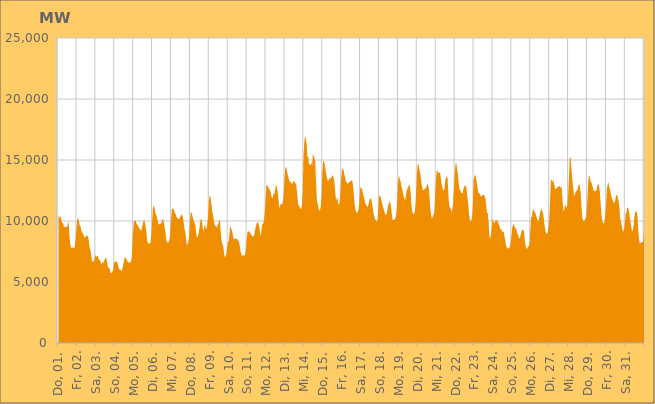
| Category | Series 0 |
|---|---|
|  Do, 01.  | 10529.707 |
|  Do, 01.  | 10336.533 |
|  Do, 01.  | 10233.402 |
|  Do, 01.  | 10405.659 |
|  Do, 01.  | 10016.815 |
|  Do, 01.  | 9789.613 |
|  Do, 01.  | 9846.499 |
|  Do, 01.  | 9518.952 |
|  Do, 01.  | 9498.58 |
|  Do, 01.  | 9533.588 |
|  Do, 01.  | 9474.868 |
|  Do, 01.  | 9495.711 |
|  Do, 01.  | 9798.766 |
|  Do, 01.  | 9944.01 |
|  Do, 01.  | 8814.898 |
|  Do, 01.  | 8136.763 |
|  Do, 01.  | 7832.044 |
|  Fr, 02.  | 7772.171 |
|  Fr, 02.  | 7843.569 |
|  Fr, 02.  | 7783.411 |
|  Fr, 02.  | 7748.673 |
|  Fr, 02.  | 7987.132 |
|  Fr, 02.  | 8657.65 |
|  Fr, 02.  | 9539.614 |
|  Fr, 02.  | 10157.018 |
|  Fr, 02.  | 10264.56 |
|  Fr, 02.  | 10034.876 |
|  Fr, 02.  | 9632.606 |
|  Fr, 02.  | 9578.474 |
|  Fr, 02.  | 9219.749 |
|  Fr, 02.  | 9088.731 |
|  Fr, 02.  | 8961.663 |
|  Fr, 02.  | 8824.625 |
|  Fr, 02.  | 8619.725 |
|  Fr, 02.  | 8675.437 |
|  Fr, 02.  | 8736.554 |
|  Fr, 02.  | 8821.018 |
|  Fr, 02.  | 8784.877 |
|  Fr, 02.  | 8654.113 |
|  Fr, 02.  | 8112.833 |
|  Fr, 02.  | 7747.127 |
|  Sa, 03.  | 7496.125 |
|  Sa, 03.  | 6970.843 |
|  Sa, 03.  | 6598.495 |
|  Sa, 03.  | 6758.544 |
|  Sa, 03.  | 6652.237 |
|  Sa, 03.  | 6864.484 |
|  Sa, 03.  | 7237.163 |
|  Sa, 03.  | 7072.676 |
|  Sa, 03.  | 7091.753 |
|  Sa, 03.  | 7154.961 |
|  Sa, 03.  | 6863.168 |
|  Sa, 03.  | 6836.559 |
|  Sa, 03.  | 6741.738 |
|  Sa, 03.  | 6559.065 |
|  Sa, 03.  | 6403.012 |
|  Sa, 03.  | 6670.532 |
|  Sa, 03.  | 6558.803 |
|  Sa, 03.  | 6756.398 |
|  Sa, 03.  | 6852.703 |
|  Sa, 03.  | 7016.3 |
|  Sa, 03.  | 6890.49 |
|  Sa, 03.  | 6496.418 |
|  Sa, 03.  | 6216.212 |
|  Sa, 03.  | 6128.025 |
|  So, 04.  | 6101.13 |
|  So, 04.  | 5755.835 |
|  So, 04.  | 5744.577 |
|  So, 04.  | 5758.574 |
|  So, 04.  | 5895.602 |
|  So, 04.  | 6231.551 |
|  So, 04.  | 6630.064 |
|  So, 04.  | 6691.717 |
|  So, 04.  | 6616.23 |
|  So, 04.  | 6706.952 |
|  So, 04.  | 6564.448 |
|  So, 04.  | 6299.091 |
|  So, 04.  | 6054.235 |
|  So, 04.  | 6023.009 |
|  So, 04.  | 6005.97 |
|  So, 04.  | 5879.537 |
|  So, 04.  | 6037.065 |
|  So, 04.  | 6328.093 |
|  So, 04.  | 6646.866 |
|  So, 04.  | 7011.484 |
|  So, 04.  | 7028.644 |
|  So, 04.  | 6911.182 |
|  So, 04.  | 6764.596 |
|  So, 04.  | 6662.201 |
|  Mo, 05.  | 6577.666 |
|  Mo, 05.  | 6625.01 |
|  Mo, 05.  | 6628.244 |
|  Mo, 05.  | 6651.648 |
|  Mo, 05.  | 7022.396 |
|  Mo, 05.  | 8024.23 |
|  Mo, 05.  | 9274.168 |
|  Mo, 05.  | 10010.13 |
|  Mo, 05.  | 10040.842 |
|  Mo, 05.  | 10001.475 |
|  Mo, 05.  | 9807.434 |
|  Mo, 05.  | 9723.593 |
|  Mo, 05.  | 9646.007 |
|  Mo, 05.  | 9450.456 |
|  Mo, 05.  | 9377.962 |
|  Mo, 05.  | 9272.21 |
|  Mo, 05.  | 9202.304 |
|  Mo, 05.  | 9459.854 |
|  Mo, 05.  | 9699.642 |
|  Mo, 05.  | 10034.983 |
|  Mo, 05.  | 10065.07 |
|  Mo, 05.  | 9877.112 |
|  Mo, 05.  | 9421.021 |
|  Mo, 05.  | 8887.11 |
|  Di, 06.  | 8286.227 |
|  Di, 06.  | 8171.97 |
|  Di, 06.  | 8140.817 |
|  Di, 06.  | 8157.813 |
|  Di, 06.  | 8257.156 |
|  Di, 06.  | 8862.049 |
|  Di, 06.  | 10032.86 |
|  Di, 06.  | 11034.859 |
|  Di, 06.  | 11286.864 |
|  Di, 06.  | 11083.124 |
|  Di, 06.  | 10651.99 |
|  Di, 06.  | 10561.061 |
|  Di, 06.  | 10269.579 |
|  Di, 06.  | 10070.448 |
|  Di, 06.  | 9772.598 |
|  Di, 06.  | 9707.713 |
|  Di, 06.  | 9784.902 |
|  Di, 06.  | 9739.165 |
|  Di, 06.  | 9865.709 |
|  Di, 06.  | 10180.245 |
|  Di, 06.  | 10124.668 |
|  Di, 06.  | 9852.929 |
|  Di, 06.  | 9403.271 |
|  Di, 06.  | 9010.484 |
|  Mi, 07.  | 8425.038 |
|  Mi, 07.  | 8265.14 |
|  Mi, 07.  | 8193.27 |
|  Mi, 07.  | 8297.545 |
|  Mi, 07.  | 8530.819 |
|  Mi, 07.  | 9060.953 |
|  Mi, 07.  | 9992.048 |
|  Mi, 07.  | 10940.264 |
|  Mi, 07.  | 11011.997 |
|  Mi, 07.  | 11007.603 |
|  Mi, 07.  | 10797.393 |
|  Mi, 07.  | 10648.533 |
|  Mi, 07.  | 10532.318 |
|  Mi, 07.  | 10332.292 |
|  Mi, 07.  | 10232.082 |
|  Mi, 07.  | 10175.733 |
|  Mi, 07.  | 10202.736 |
|  Mi, 07.  | 10197.581 |
|  Mi, 07.  | 10400.975 |
|  Mi, 07.  | 10501.787 |
|  Mi, 07.  | 10502.407 |
|  Mi, 07.  | 10323.427 |
|  Mi, 07.  | 9880.568 |
|  Mi, 07.  | 9309.777 |
|  Do, 08.  | 9139.851 |
|  Do, 08.  | 8525.452 |
|  Do, 08.  | 8037.667 |
|  Do, 08.  | 8087.292 |
|  Do, 08.  | 8312.693 |
|  Do, 08.  | 8922.248 |
|  Do, 08.  | 10061.622 |
|  Do, 08.  | 10705.818 |
|  Do, 08.  | 10704.222 |
|  Do, 08.  | 10439.516 |
|  Do, 08.  | 10183.479 |
|  Do, 08.  | 9991.294 |
|  Do, 08.  | 9836.125 |
|  Do, 08.  | 9549.21 |
|  Do, 08.  | 8923.398 |
|  Do, 08.  | 8618.108 |
|  Do, 08.  | 8725.768 |
|  Do, 08.  | 9015.013 |
|  Do, 08.  | 9404.075 |
|  Do, 08.  | 9905.863 |
|  Do, 08.  | 10205.512 |
|  Do, 08.  | 10088.837 |
|  Do, 08.  | 9547.895 |
|  Do, 08.  | 9142.056 |
|  Fr, 09.  | 9413.105 |
|  Fr, 09.  | 9809.647 |
|  Fr, 09.  | 9384.471 |
|  Fr, 09.  | 9332.834 |
|  Fr, 09.  | 9769.149 |
|  Fr, 09.  | 10483.866 |
|  Fr, 09.  | 11645.975 |
|  Fr, 09.  | 12042.567 |
|  Fr, 09.  | 12040.481 |
|  Fr, 09.  | 11519.603 |
|  Fr, 09.  | 10870.809 |
|  Fr, 09.  | 10530.66 |
|  Fr, 09.  | 10209.59 |
|  Fr, 09.  | 9759.754 |
|  Fr, 09.  | 9617.303 |
|  Fr, 09.  | 9510.223 |
|  Fr, 09.  | 9515.348 |
|  Fr, 09.  | 9633.579 |
|  Fr, 09.  | 9792.616 |
|  Fr, 09.  | 10049.787 |
|  Fr, 09.  | 10015.872 |
|  Fr, 09.  | 9215.068 |
|  Fr, 09.  | 8415.315 |
|  Fr, 09.  | 8141.303 |
|  Sa, 10.  | 7987.551 |
|  Sa, 10.  | 7489.514 |
|  Sa, 10.  | 7032.654 |
|  Sa, 10.  | 7124.692 |
|  Sa, 10.  | 7218.664 |
|  Sa, 10.  | 7769.507 |
|  Sa, 10.  | 8245.144 |
|  Sa, 10.  | 8312.283 |
|  Sa, 10.  | 8895.493 |
|  Sa, 10.  | 9532.242 |
|  Sa, 10.  | 9443.374 |
|  Sa, 10.  | 9250.226 |
|  Sa, 10.  | 9017.804 |
|  Sa, 10.  | 8621.468 |
|  Sa, 10.  | 8487.349 |
|  Sa, 10.  | 8584.149 |
|  Sa, 10.  | 8544.465 |
|  Sa, 10.  | 8525.974 |
|  Sa, 10.  | 8530.084 |
|  Sa, 10.  | 8376.597 |
|  Sa, 10.  | 8328.932 |
|  Sa, 10.  | 8052.787 |
|  Sa, 10.  | 7541.128 |
|  Sa, 10.  | 7323.861 |
|  So, 11.  | 7086.737 |
|  So, 11.  | 7225.431 |
|  So, 11.  | 7199.097 |
|  So, 11.  | 7131.192 |
|  So, 11.  | 7285.737 |
|  So, 11.  | 7773.653 |
|  So, 11.  | 8542.854 |
|  So, 11.  | 9121.005 |
|  So, 11.  | 9098.106 |
|  So, 11.  | 9199.176 |
|  So, 11.  | 9060.299 |
|  So, 11.  | 8938.689 |
|  So, 11.  | 8856.494 |
|  So, 11.  | 8726.173 |
|  So, 11.  | 8770.369 |
|  So, 11.  | 8732.192 |
|  So, 11.  | 9038.479 |
|  So, 11.  | 9396.121 |
|  So, 11.  | 9669.865 |
|  So, 11.  | 9842.733 |
|  So, 11.  | 9920.02 |
|  So, 11.  | 9758.421 |
|  So, 11.  | 9526.023 |
|  So, 11.  | 8991.296 |
|  Mo, 12.  | 8741.05 |
|  Mo, 12.  | 9450.156 |
|  Mo, 12.  | 9770.098 |
|  Mo, 12.  | 9740.806 |
|  Mo, 12.  | 10154.949 |
|  Mo, 12.  | 10681.881 |
|  Mo, 12.  | 11772.958 |
|  Mo, 12.  | 12975.647 |
|  Mo, 12.  | 12905.045 |
|  Mo, 12.  | 12838.434 |
|  Mo, 12.  | 12699.101 |
|  Mo, 12.  | 12571.12 |
|  Mo, 12.  | 12449.72 |
|  Mo, 12.  | 12155.104 |
|  Mo, 12.  | 11907.767 |
|  Mo, 12.  | 11897.613 |
|  Mo, 12.  | 12258.328 |
|  Mo, 12.  | 12205.444 |
|  Mo, 12.  | 12499.811 |
|  Mo, 12.  | 12925.302 |
|  Mo, 12.  | 12853.913 |
|  Mo, 12.  | 12509.906 |
|  Mo, 12.  | 12022.841 |
|  Mo, 12.  | 11269.834 |
|  Di, 13.  | 11029.107 |
|  Di, 13.  | 11390.864 |
|  Di, 13.  | 11398.339 |
|  Di, 13.  | 11325.055 |
|  Di, 13.  | 11586.458 |
|  Di, 13.  | 12272.787 |
|  Di, 13.  | 13523.71 |
|  Di, 13.  | 14333.438 |
|  Di, 13.  | 14465.124 |
|  Di, 13.  | 14155.82 |
|  Di, 13.  | 13781.302 |
|  Di, 13.  | 13543.219 |
|  Di, 13.  | 13349.174 |
|  Di, 13.  | 13191.632 |
|  Di, 13.  | 13198.03 |
|  Di, 13.  | 13040.455 |
|  Di, 13.  | 13081.642 |
|  Di, 13.  | 13253.882 |
|  Di, 13.  | 13284.797 |
|  Di, 13.  | 13146.584 |
|  Di, 13.  | 13087.559 |
|  Di, 13.  | 12906.938 |
|  Di, 13.  | 12246.95 |
|  Di, 13.  | 11496.5 |
|  Mi, 14.  | 11254.484 |
|  Mi, 14.  | 11192.483 |
|  Mi, 14.  | 11000.555 |
|  Mi, 14.  | 10976.282 |
|  Mi, 14.  | 11287.2 |
|  Mi, 14.  | 12358.431 |
|  Mi, 14.  | 15085.202 |
|  Mi, 14.  | 16369.51 |
|  Mi, 14.  | 16919.316 |
|  Mi, 14.  | 16818.05 |
|  Mi, 14.  | 16325.845 |
|  Mi, 14.  | 15299.617 |
|  Mi, 14.  | 15290.634 |
|  Mi, 14.  | 14649.702 |
|  Mi, 14.  | 14642.315 |
|  Mi, 14.  | 14540.523 |
|  Mi, 14.  | 14804.078 |
|  Mi, 14.  | 14571.708 |
|  Mi, 14.  | 15472.823 |
|  Mi, 14.  | 15343.81 |
|  Mi, 14.  | 15151.949 |
|  Mi, 14.  | 14842.303 |
|  Mi, 14.  | 13162.531 |
|  Mi, 14.  | 11798.211 |
|  Do, 15.  | 11432.457 |
|  Do, 15.  | 11108.313 |
|  Do, 15.  | 10840.644 |
|  Do, 15.  | 10926.781 |
|  Do, 15.  | 11167.095 |
|  Do, 15.  | 12078.19 |
|  Do, 15.  | 14036.841 |
|  Do, 15.  | 14932.538 |
|  Do, 15.  | 14889.247 |
|  Do, 15.  | 14657.616 |
|  Do, 15.  | 14255.425 |
|  Do, 15.  | 13803.549 |
|  Do, 15.  | 13551.982 |
|  Do, 15.  | 13270.766 |
|  Do, 15.  | 13329.463 |
|  Do, 15.  | 13524.739 |
|  Do, 15.  | 13495.227 |
|  Do, 15.  | 13471.776 |
|  Do, 15.  | 13701.6 |
|  Do, 15.  | 13727.512 |
|  Do, 15.  | 13613.618 |
|  Do, 15.  | 13318.861 |
|  Do, 15.  | 12730.504 |
|  Do, 15.  | 11835.434 |
|  Fr, 16.  | 11737.186 |
|  Fr, 16.  | 11999.883 |
|  Fr, 16.  | 11434.313 |
|  Fr, 16.  | 11343.227 |
|  Fr, 16.  | 11599.645 |
|  Fr, 16.  | 12346.194 |
|  Fr, 16.  | 13555.305 |
|  Fr, 16.  | 14246.805 |
|  Fr, 16.  | 14311.722 |
|  Fr, 16.  | 14129.759 |
|  Fr, 16.  | 13820.115 |
|  Fr, 16.  | 13541.526 |
|  Fr, 16.  | 13177.377 |
|  Fr, 16.  | 13225.505 |
|  Fr, 16.  | 13007.624 |
|  Fr, 16.  | 13113.843 |
|  Fr, 16.  | 13196.627 |
|  Fr, 16.  | 13206.998 |
|  Fr, 16.  | 13284.799 |
|  Fr, 16.  | 13327.876 |
|  Fr, 16.  | 13325.027 |
|  Fr, 16.  | 12851.113 |
|  Fr, 16.  | 12204.528 |
|  Fr, 16.  | 11394.074 |
|  Sa, 17.  | 10971.341 |
|  Sa, 17.  | 10682.271 |
|  Sa, 17.  | 10689.238 |
|  Sa, 17.  | 10754.533 |
|  Sa, 17.  | 11002.277 |
|  Sa, 17.  | 11683.485 |
|  Sa, 17.  | 12594.949 |
|  Sa, 17.  | 12819.376 |
|  Sa, 17.  | 12649.457 |
|  Sa, 17.  | 12442.98 |
|  Sa, 17.  | 12094.377 |
|  Sa, 17.  | 11906.014 |
|  Sa, 17.  | 11594.225 |
|  Sa, 17.  | 11350.256 |
|  Sa, 17.  | 11316.724 |
|  Sa, 17.  | 11120.709 |
|  Sa, 17.  | 11227.621 |
|  Sa, 17.  | 11483.157 |
|  Sa, 17.  | 11754.547 |
|  Sa, 17.  | 11853.348 |
|  Sa, 17.  | 11841.255 |
|  Sa, 17.  | 11478.188 |
|  Sa, 17.  | 11038.52 |
|  Sa, 17.  | 10560.472 |
|  So, 18.  | 10387.607 |
|  So, 18.  | 10151.713 |
|  So, 18.  | 10043.455 |
|  So, 18.  | 9950.271 |
|  So, 18.  | 10081.894 |
|  So, 18.  | 11008.173 |
|  So, 18.  | 11991.096 |
|  So, 18.  | 12119.902 |
|  So, 18.  | 11974.254 |
|  So, 18.  | 11706.868 |
|  So, 18.  | 11400.714 |
|  So, 18.  | 11186.03 |
|  So, 18.  | 10926.728 |
|  So, 18.  | 10699.705 |
|  So, 18.  | 10527.653 |
|  So, 18.  | 10484.803 |
|  So, 18.  | 10718.019 |
|  So, 18.  | 11031.858 |
|  So, 18.  | 11421.413 |
|  So, 18.  | 11572.825 |
|  So, 18.  | 11560.658 |
|  So, 18.  | 11203.324 |
|  So, 18.  | 10673.623 |
|  So, 18.  | 10112.069 |
|  Mo, 19.  | 10077.185 |
|  Mo, 19.  | 10097.936 |
|  Mo, 19.  | 10156.862 |
|  Mo, 19.  | 10280.285 |
|  Mo, 19.  | 10694.825 |
|  Mo, 19.  | 11671.021 |
|  Mo, 19.  | 12963.677 |
|  Mo, 19.  | 13803.511 |
|  Mo, 19.  | 13515.632 |
|  Mo, 19.  | 13334.829 |
|  Mo, 19.  | 13009.519 |
|  Mo, 19.  | 12696.438 |
|  Mo, 19.  | 12418.138 |
|  Mo, 19.  | 12051.315 |
|  Mo, 19.  | 11876.242 |
|  Mo, 19.  | 11712.381 |
|  Mo, 19.  | 12015.511 |
|  Mo, 19.  | 12499.396 |
|  Mo, 19.  | 12641.637 |
|  Mo, 19.  | 12784.186 |
|  Mo, 19.  | 12969.051 |
|  Mo, 19.  | 12894.996 |
|  Mo, 19.  | 12365.927 |
|  Mo, 19.  | 11363.607 |
|  Di, 20.  | 10828.228 |
|  Di, 20.  | 10589.563 |
|  Di, 20.  | 10567.361 |
|  Di, 20.  | 10670.656 |
|  Di, 20.  | 11168.174 |
|  Di, 20.  | 12293.058 |
|  Di, 20.  | 13823.6 |
|  Di, 20.  | 14650.267 |
|  Di, 20.  | 14652.409 |
|  Di, 20.  | 14293.47 |
|  Di, 20.  | 13980.502 |
|  Di, 20.  | 13539.279 |
|  Di, 20.  | 13016.704 |
|  Di, 20.  | 12682.462 |
|  Di, 20.  | 12513.989 |
|  Di, 20.  | 12560.375 |
|  Di, 20.  | 12629.963 |
|  Di, 20.  | 12687.865 |
|  Di, 20.  | 12758.694 |
|  Di, 20.  | 13052.038 |
|  Di, 20.  | 12947.857 |
|  Di, 20.  | 12721.665 |
|  Di, 20.  | 11971.566 |
|  Di, 20.  | 11073.267 |
|  Mi, 21.  | 10499.236 |
|  Mi, 21.  | 10188.118 |
|  Mi, 21.  | 10316.012 |
|  Mi, 21.  | 10535.588 |
|  Mi, 21.  | 10652.774 |
|  Mi, 21.  | 11777.276 |
|  Mi, 21.  | 13153.782 |
|  Mi, 21.  | 14096.616 |
|  Mi, 21.  | 14167.47 |
|  Mi, 21.  | 13900.033 |
|  Mi, 21.  | 13973.923 |
|  Mi, 21.  | 14027.303 |
|  Mi, 21.  | 13745.706 |
|  Mi, 21.  | 13131.597 |
|  Mi, 21.  | 12862.837 |
|  Mi, 21.  | 12596.278 |
|  Mi, 21.  | 12475.427 |
|  Mi, 21.  | 12683.824 |
|  Mi, 21.  | 13320.586 |
|  Mi, 21.  | 13593.361 |
|  Mi, 21.  | 13662.716 |
|  Mi, 21.  | 13443.478 |
|  Mi, 21.  | 12109.902 |
|  Mi, 21.  | 11198.909 |
|  Do, 22.  | 11133.62 |
|  Do, 22.  | 10945.931 |
|  Do, 22.  | 10736.795 |
|  Do, 22.  | 10956.369 |
|  Do, 22.  | 11593.813 |
|  Do, 22.  | 12741.513 |
|  Do, 22.  | 13958.789 |
|  Do, 22.  | 14662.989 |
|  Do, 22.  | 14752.081 |
|  Do, 22.  | 14296.643 |
|  Do, 22.  | 13849.112 |
|  Do, 22.  | 13088.864 |
|  Do, 22.  | 12613.345 |
|  Do, 22.  | 12547.389 |
|  Do, 22.  | 12351.4 |
|  Do, 22.  | 12266.664 |
|  Do, 22.  | 12219.767 |
|  Do, 22.  | 12591.704 |
|  Do, 22.  | 12800.21 |
|  Do, 22.  | 12932.904 |
|  Do, 22.  | 12857.158 |
|  Do, 22.  | 12634.662 |
|  Do, 22.  | 11992.164 |
|  Do, 22.  | 11517.577 |
|  Fr, 23.  | 10634.33 |
|  Fr, 23.  | 10156.95 |
|  Fr, 23.  | 9937.284 |
|  Fr, 23.  | 10050.572 |
|  Fr, 23.  | 10310.397 |
|  Fr, 23.  | 11272.053 |
|  Fr, 23.  | 13310.069 |
|  Fr, 23.  | 13685.202 |
|  Fr, 23.  | 13773.63 |
|  Fr, 23.  | 13536.317 |
|  Fr, 23.  | 13135.155 |
|  Fr, 23.  | 12713.013 |
|  Fr, 23.  | 12324.396 |
|  Fr, 23.  | 12259.719 |
|  Fr, 23.  | 12232.77 |
|  Fr, 23.  | 12039.66 |
|  Fr, 23.  | 11979.091 |
|  Fr, 23.  | 12157.893 |
|  Fr, 23.  | 12138.128 |
|  Fr, 23.  | 12135.494 |
|  Fr, 23.  | 12030.495 |
|  Fr, 23.  | 11795.125 |
|  Fr, 23.  | 11207.184 |
|  Fr, 23.  | 10631.53 |
|  Sa, 24.  | 10671.62 |
|  Sa, 24.  | 9960.392 |
|  Sa, 24.  | 8826.696 |
|  Sa, 24.  | 8557.029 |
|  Sa, 24.  | 8894.996 |
|  Sa, 24.  | 9456.553 |
|  Sa, 24.  | 10192.513 |
|  Sa, 24.  | 10011.538 |
|  Sa, 24.  | 9823.178 |
|  Sa, 24.  | 9875.339 |
|  Sa, 24.  | 10098.859 |
|  Sa, 24.  | 9999.553 |
|  Sa, 24.  | 10092.555 |
|  Sa, 24.  | 9919.467 |
|  Sa, 24.  | 9729.876 |
|  Sa, 24.  | 9573.903 |
|  Sa, 24.  | 9286.922 |
|  Sa, 24.  | 9365.463 |
|  Sa, 24.  | 9157.477 |
|  Sa, 24.  | 9091.61 |
|  Sa, 24.  | 9142.456 |
|  Sa, 24.  | 8779.311 |
|  Sa, 24.  | 8466.404 |
|  Sa, 24.  | 8001.866 |
|  So, 25.  | 7842.157 |
|  So, 25.  | 7799.744 |
|  So, 25.  | 7750.321 |
|  So, 25.  | 7735.64 |
|  So, 25.  | 7910.378 |
|  So, 25.  | 8172.234 |
|  So, 25.  | 8799.676 |
|  So, 25.  | 9498.477 |
|  So, 25.  | 9647.508 |
|  So, 25.  | 9785.461 |
|  So, 25.  | 9543.094 |
|  So, 25.  | 9407.245 |
|  So, 25.  | 9360.44 |
|  So, 25.  | 9081.467 |
|  So, 25.  | 8895.921 |
|  So, 25.  | 8708.966 |
|  So, 25.  | 8565.929 |
|  So, 25.  | 8639.695 |
|  So, 25.  | 8952.562 |
|  So, 25.  | 9167.017 |
|  So, 25.  | 9330.037 |
|  So, 25.  | 9249.374 |
|  So, 25.  | 9146.62 |
|  So, 25.  | 8354.917 |
|  So, 25.  | 7929.225 |
|  Mo, 26.  | 7757.803 |
|  Mo, 26.  | 7748.907 |
|  Mo, 26.  | 7873.866 |
|  Mo, 26.  | 7934.001 |
|  Mo, 26.  | 8216.173 |
|  Mo, 26.  | 9317.493 |
|  Mo, 26.  | 10331.764 |
|  Mo, 26.  | 10348.711 |
|  Mo, 26.  | 10866.299 |
|  Mo, 26.  | 10958.932 |
|  Mo, 26.  | 10773.867 |
|  Mo, 26.  | 10695.098 |
|  Mo, 26.  | 10510.108 |
|  Mo, 26.  | 10283.535 |
|  Mo, 26.  | 10095.063 |
|  Mo, 26.  | 9931.572 |
|  Mo, 26.  | 10208.28 |
|  Mo, 26.  | 10564.917 |
|  Mo, 26.  | 10884.88 |
|  Mo, 26.  | 11019.273 |
|  Mo, 26.  | 10800.307 |
|  Mo, 26.  | 10665.06 |
|  Mo, 26.  | 10243.143 |
|  Mo, 26.  | 9637.658 |
|  Di, 27.  | 9270.043 |
|  Di, 27.  | 8992.993 |
|  Di, 27.  | 8918.854 |
|  Di, 27.  | 9077.296 |
|  Di, 27.  | 9472.459 |
|  Di, 27.  | 10190.645 |
|  Di, 27.  | 11710.411 |
|  Di, 27.  | 13281.479 |
|  Di, 27.  | 13406.151 |
|  Di, 27.  | 13187.073 |
|  Di, 27.  | 13424.636 |
|  Di, 27.  | 13089.441 |
|  Di, 27.  | 12789.775 |
|  Di, 27.  | 12607.773 |
|  Di, 27.  | 12638.609 |
|  Di, 27.  | 12755.518 |
|  Di, 27.  | 12832.209 |
|  Di, 27.  | 12828.307 |
|  Di, 27.  | 12868.604 |
|  Di, 27.  | 12727.184 |
|  Di, 27.  | 12844.781 |
|  Di, 27.  | 12568.639 |
|  Di, 27.  | 11544.136 |
|  Di, 27.  | 10826.951 |
|  Mi, 28.  | 10860.806 |
|  Mi, 28.  | 11401.576 |
|  Mi, 28.  | 11166.367 |
|  Mi, 28.  | 11094.974 |
|  Mi, 28.  | 11294.496 |
|  Mi, 28.  | 12184.671 |
|  Mi, 28.  | 13508.893 |
|  Mi, 28.  | 15228.255 |
|  Mi, 28.  | 15262.693 |
|  Mi, 28.  | 14379.595 |
|  Mi, 28.  | 13589.405 |
|  Mi, 28.  | 12992.31 |
|  Mi, 28.  | 12273.536 |
|  Mi, 28.  | 12009.212 |
|  Mi, 28.  | 12308.711 |
|  Mi, 28.  | 12447.024 |
|  Mi, 28.  | 12455.781 |
|  Mi, 28.  | 12611.817 |
|  Mi, 28.  | 12926.317 |
|  Mi, 28.  | 13035.37 |
|  Mi, 28.  | 12782.547 |
|  Mi, 28.  | 12213.405 |
|  Mi, 28.  | 11052.08 |
|  Mi, 28.  | 10237.493 |
|  Do, 29.  | 10052.018 |
|  Do, 29.  | 9968.612 |
|  Do, 29.  | 10082.034 |
|  Do, 29.  | 10221.183 |
|  Do, 29.  | 10433.795 |
|  Do, 29.  | 11307.963 |
|  Do, 29.  | 12722.529 |
|  Do, 29.  | 13698.33 |
|  Do, 29.  | 13678.296 |
|  Do, 29.  | 13362.294 |
|  Do, 29.  | 13157.233 |
|  Do, 29.  | 13080.163 |
|  Do, 29.  | 12803.25 |
|  Do, 29.  | 12542.699 |
|  Do, 29.  | 12479.424 |
|  Do, 29.  | 12410.344 |
|  Do, 29.  | 12473.854 |
|  Do, 29.  | 12549.89 |
|  Do, 29.  | 12881.259 |
|  Do, 29.  | 13041.318 |
|  Do, 29.  | 12898.444 |
|  Do, 29.  | 12506.077 |
|  Do, 29.  | 11613.442 |
|  Do, 29.  | 10768.04 |
|  Fr, 30.  | 10129.675 |
|  Fr, 30.  | 9836.456 |
|  Fr, 30.  | 9774.656 |
|  Fr, 30.  | 9942.491 |
|  Fr, 30.  | 10470.516 |
|  Fr, 30.  | 11207.563 |
|  Fr, 30.  | 12545.326 |
|  Fr, 30.  | 12960.12 |
|  Fr, 30.  | 13175.884 |
|  Fr, 30.  | 12845.001 |
|  Fr, 30.  | 12575.79 |
|  Fr, 30.  | 12311.036 |
|  Fr, 30.  | 11956.496 |
|  Fr, 30.  | 11789.947 |
|  Fr, 30.  | 11573.962 |
|  Fr, 30.  | 11498.471 |
|  Fr, 30.  | 11538.022 |
|  Fr, 30.  | 11766.697 |
|  Fr, 30.  | 12133.499 |
|  Fr, 30.  | 12144.861 |
|  Fr, 30.  | 11932.06 |
|  Fr, 30.  | 11593.731 |
|  Fr, 30.  | 11061.966 |
|  Fr, 30.  | 10184.845 |
|  Sa, 31.  | 9900.755 |
|  Sa, 31.  | 9653.288 |
|  Sa, 31.  | 9209.667 |
|  Sa, 31.  | 9109.761 |
|  Sa, 31.  | 9380.454 |
|  Sa, 31.  | 9877.364 |
|  Sa, 31.  | 10641.595 |
|  Sa, 31.  | 10666.372 |
|  Sa, 31.  | 11119.854 |
|  Sa, 31.  | 11083.523 |
|  Sa, 31.  | 10862.664 |
|  Sa, 31.  | 10329.194 |
|  Sa, 31.  | 10061.888 |
|  Sa, 31.  | 9539.727 |
|  Sa, 31.  | 9161.779 |
|  Sa, 31.  | 9232.795 |
|  Sa, 31.  | 9576.833 |
|  Sa, 31.  | 10261.155 |
|  Sa, 31.  | 10692.952 |
|  Sa, 31.  | 10827.221 |
|  Sa, 31.  | 10751.937 |
|  Sa, 31.  | 10370.772 |
|  Sa, 31.  | 9178.325 |
|  Sa, 31.  | 8458.33 |
|  So, 01.  | 8159.43 |
|  So, 01.  | 8221.418 |
|  So, 01.  | 8263.007 |
|  So, 01.  | 8300.732 |
|  So, 01.  | 8219.134 |